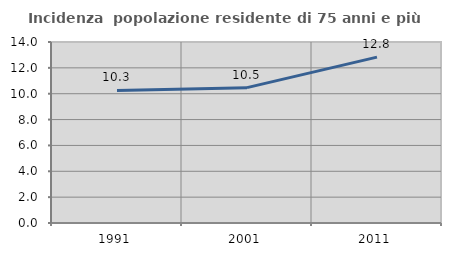
| Category | Incidenza  popolazione residente di 75 anni e più |
|---|---|
| 1991.0 | 10.255 |
| 2001.0 | 10.471 |
| 2011.0 | 12.833 |